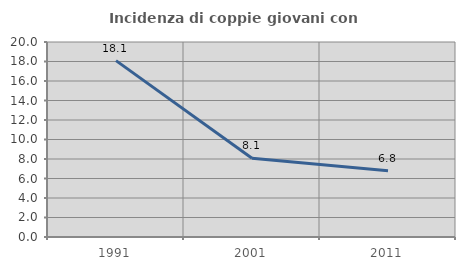
| Category | Incidenza di coppie giovani con figli |
|---|---|
| 1991.0 | 18.092 |
| 2001.0 | 8.081 |
| 2011.0 | 6.804 |